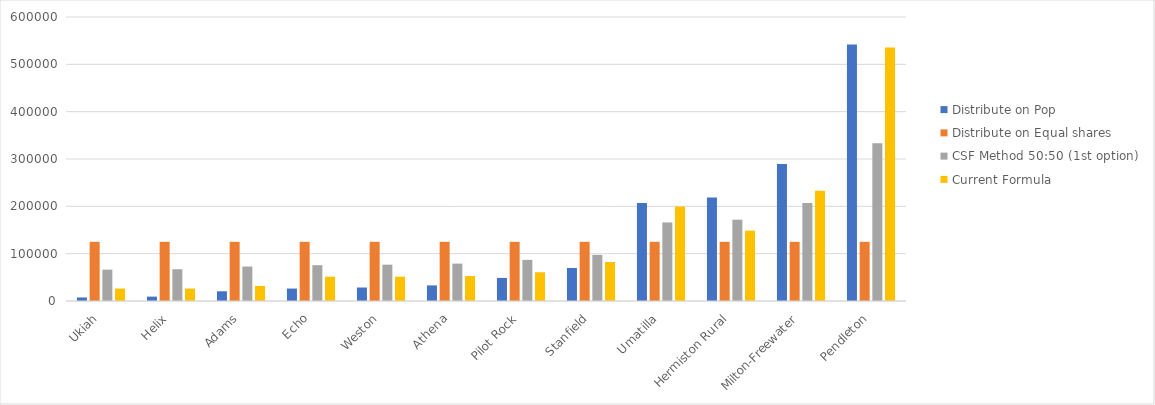
| Category | Distribute on Pop | Distribute on Equal shares | CSF Method 50:50 (1st option) | Current Formula |
|---|---|---|---|---|
| Ukiah | 7488.747 | 125016.5 | 66252.528 | 26265 |
| Helix | 9226.332 | 125016.5 | 67121.318 | 26265 |
| Adams | 20557.344 | 125016.5 | 72786.806 | 31885.699 |
| Echo | 26284.033 | 125016.5 | 75650.142 | 51300.646 |
| Weston | 28462.132 | 125016.5 | 76739.188 | 51300.646 |
| Athena | 32940.696 | 125016.5 | 78978.463 | 52733.508 |
| Pilot Rock | 48799.219 | 125016.5 | 86907.699 | 60735.391 |
| Stanfield | 69674.712 | 125016.5 | 97345.413 | 82444.301 |
| Umatilla | 207017.348 | 125016.5 | 166016.515 | 199898.911 |
| Hermiston Rural | 218523.739 | 125016.5 | 171769.693 | 148764.394 |
| Milton-Freewater | 289418.035 | 125016.5 | 207216.729 | 233095.644 |
| Pendleton | 541808.379 | 125016.5 | 333411.504 | 535508.629 |